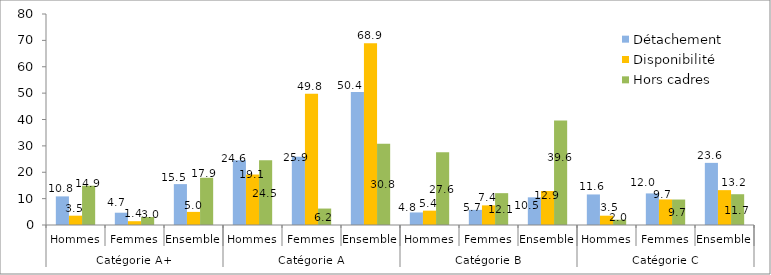
| Category | Détachement | Disponibilité | Hors cadres  |
|---|---|---|---|
| 0 | 10.846 | 3.53 | 14.889 |
| 1 | 4.657 | 1.439 | 3.018 |
| 2 | 15.503 | 4.97 | 17.907 |
| 3 | 24.568 | 19.138 | 24.547 |
| 4 | 25.881 | 49.8 | 6.237 |
| 5 | 50.45 | 68.939 | 30.785 |
| 6 | 4.755 | 5.436 | 27.565 |
| 7 | 5.735 | 7.443 | 12.072 |
| 8 | 10.49 | 12.879 | 39.638 |
| 9 | 11.582 | 3.528 | 2.012 |
| 10 | 11.975 | 9.684 | 9.658 |
| 11 | 23.557 | 13.214 | 11.67 |